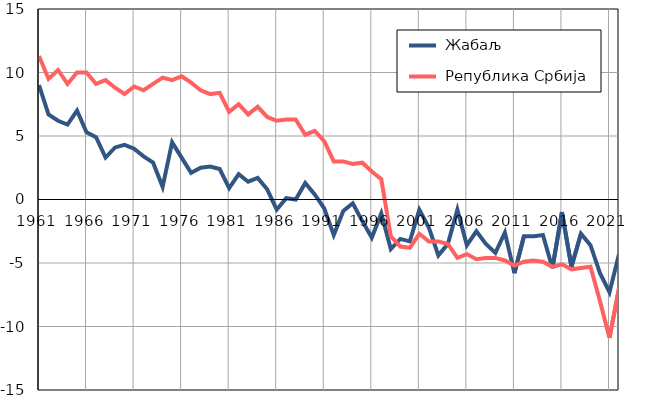
| Category |  Жабаљ |  Република Србија |
|---|---|---|
| 1961.0 | 9 | 11.3 |
| 1962.0 | 6.7 | 9.5 |
| 1963.0 | 6.2 | 10.2 |
| 1964.0 | 5.9 | 9.1 |
| 1965.0 | 7 | 10 |
| 1966.0 | 5.3 | 10 |
| 1967.0 | 4.9 | 9.1 |
| 1968.0 | 3.3 | 9.4 |
| 1969.0 | 4.1 | 8.8 |
| 1970.0 | 4.3 | 8.3 |
| 1971.0 | 4 | 8.9 |
| 1972.0 | 3.4 | 8.6 |
| 1973.0 | 2.9 | 9.1 |
| 1974.0 | 1 | 9.6 |
| 1975.0 | 4.5 | 9.4 |
| 1976.0 | 3.3 | 9.7 |
| 1977.0 | 2.1 | 9.2 |
| 1978.0 | 2.5 | 8.6 |
| 1979.0 | 2.6 | 8.3 |
| 1980.0 | 2.4 | 8.4 |
| 1981.0 | 0.9 | 6.9 |
| 1982.0 | 2 | 7.5 |
| 1983.0 | 1.4 | 6.7 |
| 1984.0 | 1.7 | 7.3 |
| 1985.0 | 0.8 | 6.5 |
| 1986.0 | -0.8 | 6.2 |
| 1987.0 | 0.1 | 6.3 |
| 1988.0 | 0 | 6.3 |
| 1989.0 | 1.3 | 5.1 |
| 1990.0 | 0.4 | 5.4 |
| 1991.0 | -0.7 | 4.6 |
| 1992.0 | -2.8 | 3 |
| 1993.0 | -0.9 | 3 |
| 1994.0 | -0.3 | 2.8 |
| 1995.0 | -1.7 | 2.9 |
| 1996.0 | -3 | 2.2 |
| 1997.0 | -1.1 | 1.6 |
| 1998.0 | -3.9 | -2.9 |
| 1999.0 | -3.1 | -3.7 |
| 2000.0 | -3.3 | -3.8 |
| 2001.0 | -0.8 | -2.7 |
| 2002.0 | -2.2 | -3.3 |
| 2003.0 | -4.4 | -3.3 |
| 2004.0 | -3.5 | -3.5 |
| 2005.0 | -0.8 | -4.6 |
| 2006.0 | -3.6 | -4.3 |
| 2007.0 | -2.5 | -4.7 |
| 2008.0 | -3.5 | -4.6 |
| 2009.0 | -4.2 | -4.6 |
| 2010.0 | -2.6 | -4.8 |
| 2011.0 | -5.8 | -5.2 |
| 2012.0 | -2.9 | -4.9 |
| 2013.0 | -2.9 | -4.8 |
| 2014.0 | -2.8 | -4.9 |
| 2015.0 | -5.4 | -5.3 |
| 2016.0 | -1 | -5.1 |
| 2017.0 | -5.3 | -5.5 |
| 2018.0 | -2.7 | -5.4 |
| 2019.0 | -3.6 | -5.3 |
| 2020.0 | -5.8 | -8 |
| 2021.0 | -7.3 | -10.9 |
| 2022.0 | -4.3 | -7 |